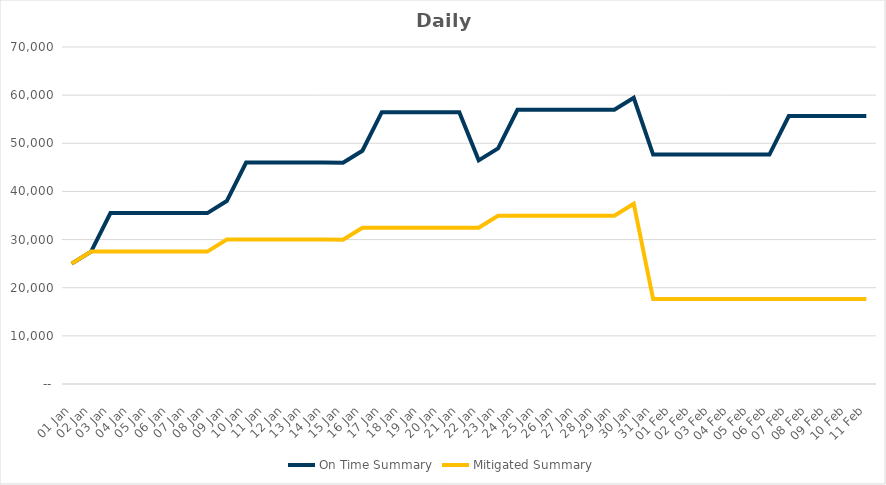
| Category | On Time Summary | Mitigated Summary |
|---|---|---|
| 2020-01-01 | 25000 | 25000 |
| 2020-01-02 | 27500 | 27500 |
| 2020-01-03 | 35500 | 27500 |
| 2020-01-04 | 35500 | 27500 |
| 2020-01-05 | 35500 | 27500 |
| 2020-01-06 | 35500 | 27500 |
| 2020-01-07 | 35500 | 27500 |
| 2020-01-08 | 35500 | 27500 |
| 2020-01-09 | 38000 | 30000 |
| 2020-01-10 | 46000 | 30000 |
| 2020-01-11 | 46000 | 30000 |
| 2020-01-12 | 46000 | 30000 |
| 2020-01-13 | 46000 | 30000 |
| 2020-01-14 | 46000 | 30000 |
| 2020-01-15 | 45953 | 29953 |
| 2020-01-16 | 48453 | 32453 |
| 2020-01-17 | 56453 | 32453 |
| 2020-01-18 | 56453 | 32453 |
| 2020-01-19 | 56453 | 32453 |
| 2020-01-20 | 56453 | 32453 |
| 2020-01-21 | 56453 | 32453 |
| 2020-01-22 | 46453 | 32453 |
| 2020-01-23 | 48953 | 34953 |
| 2020-01-24 | 56953 | 34953 |
| 2020-01-25 | 56953 | 34953 |
| 2020-01-26 | 56953 | 34953 |
| 2020-01-27 | 56953 | 34953 |
| 2020-01-28 | 56953 | 34953 |
| 2020-01-29 | 56953 | 34953 |
| 2020-01-30 | 59453 | 37453 |
| 2020-01-31 | 47653 | 17653 |
| 2020-02-01 | 47653 | 17653 |
| 2020-02-02 | 47653 | 17653 |
| 2020-02-03 | 47653 | 17653 |
| 2020-02-04 | 47653 | 17653 |
| 2020-02-05 | 47653 | 17653 |
| 2020-02-06 | 47653 | 17653 |
| 2020-02-07 | 55653 | 17653 |
| 2020-02-08 | 55653 | 17653 |
| 2020-02-09 | 55653 | 17653 |
| 2020-02-10 | 55653 | 17653 |
| 2020-02-11 | 55653 | 17653 |